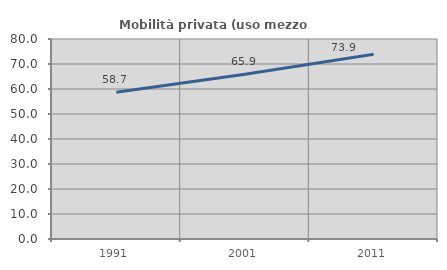
| Category | Mobilità privata (uso mezzo privato) |
|---|---|
| 1991.0 | 58.702 |
| 2001.0 | 65.889 |
| 2011.0 | 73.859 |